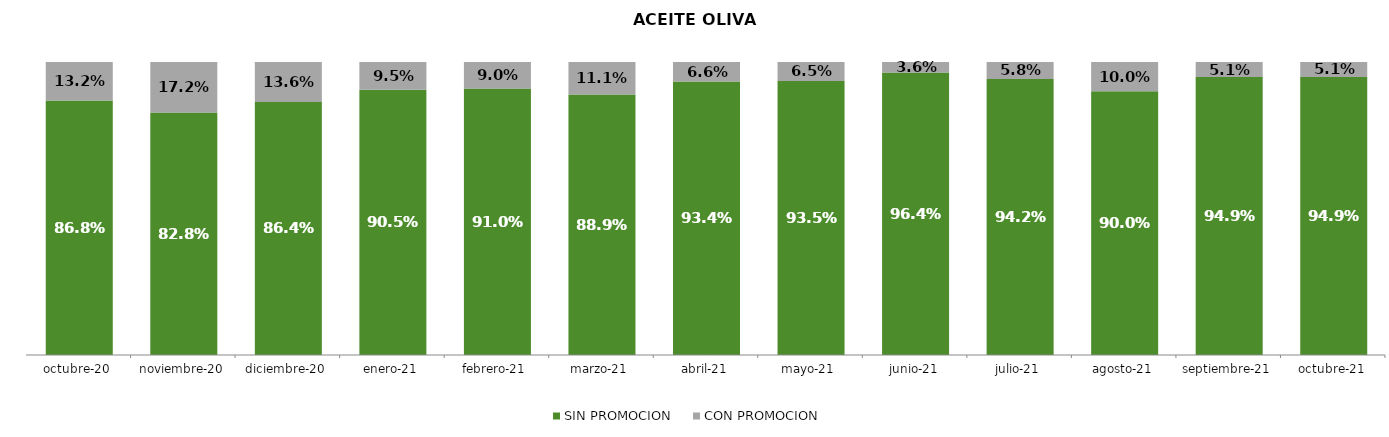
| Category | SIN PROMOCION   | CON PROMOCION   |
|---|---|---|
| 2020-10-01 | 0.868 | 0.132 |
| 2020-11-01 | 0.828 | 0.172 |
| 2020-12-01 | 0.864 | 0.136 |
| 2021-01-01 | 0.905 | 0.095 |
| 2021-02-01 | 0.91 | 0.09 |
| 2021-03-01 | 0.889 | 0.111 |
| 2021-04-01 | 0.934 | 0.066 |
| 2021-05-01 | 0.935 | 0.065 |
| 2021-06-01 | 0.964 | 0.036 |
| 2021-07-01 | 0.942 | 0.058 |
| 2021-08-01 | 0.9 | 0.1 |
| 2021-09-01 | 0.949 | 0.051 |
| 2021-10-01 | 0.949 | 0.051 |